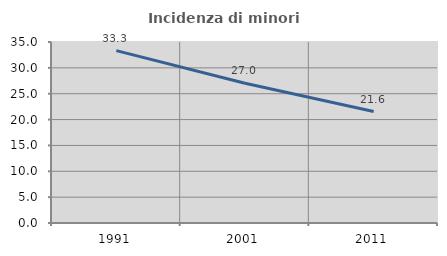
| Category | Incidenza di minori stranieri |
|---|---|
| 1991.0 | 33.333 |
| 2001.0 | 27.027 |
| 2011.0 | 21.552 |